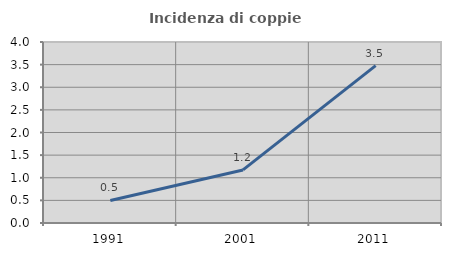
| Category | Incidenza di coppie miste |
|---|---|
| 1991.0 | 0.498 |
| 2001.0 | 1.173 |
| 2011.0 | 3.478 |